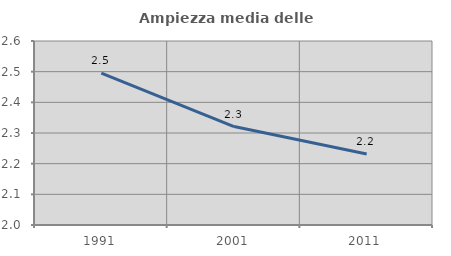
| Category | Ampiezza media delle famiglie |
|---|---|
| 1991.0 | 2.496 |
| 2001.0 | 2.321 |
| 2011.0 | 2.231 |